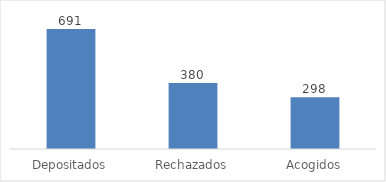
| Category | Series 0 |
|---|---|
| Depositados | 691 |
| Rechazados | 380 |
| Acogidos | 298 |